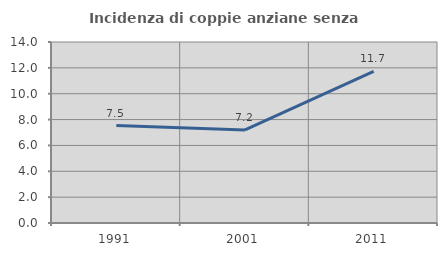
| Category | Incidenza di coppie anziane senza figli  |
|---|---|
| 1991.0 | 7.538 |
| 2001.0 | 7.194 |
| 2011.0 | 11.724 |